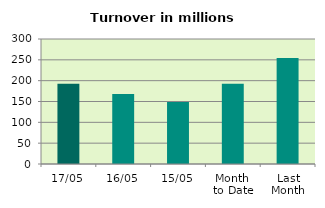
| Category | Series 0 |
|---|---|
| 17/05 | 192.616 |
| 16/05 | 167.877 |
| 15/05 | 148.63 |
| Month 
to Date | 192.646 |
| Last
Month | 254.458 |